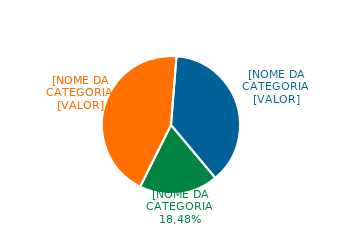
| Category | Series 0 |
|---|---|
| Grupo de controle | 0.185 |
| Investidores não-brasileiros * | 0.439 |
| Investidores brasileiros * | 0.376 |